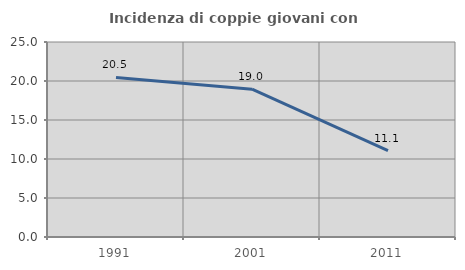
| Category | Incidenza di coppie giovani con figli |
|---|---|
| 1991.0 | 20.455 |
| 2001.0 | 18.95 |
| 2011.0 | 11.066 |